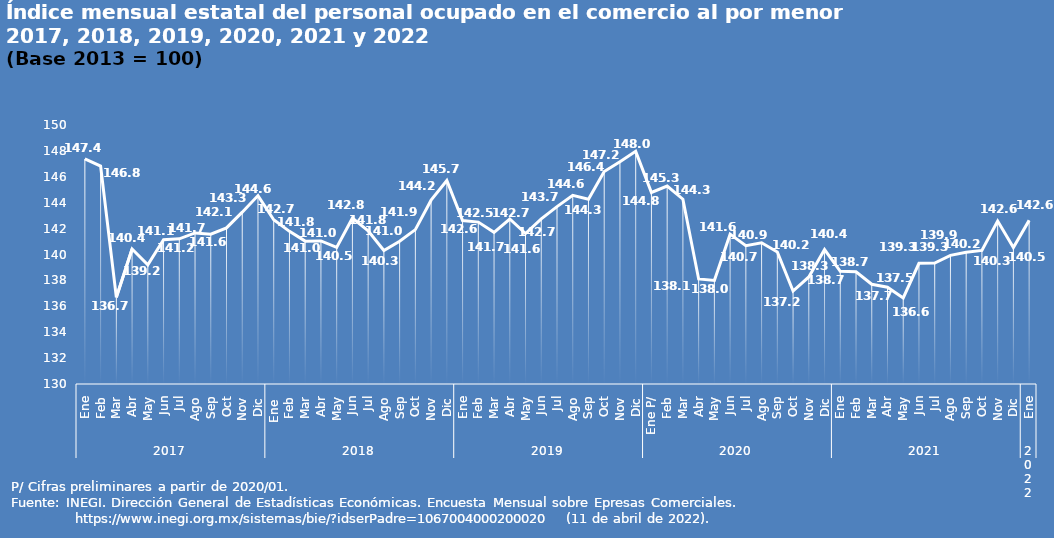
| Category | Series 0 |
|---|---|
| 0 | 147.391 |
| 1 | 146.826 |
| 2 | 136.688 |
| 3 | 140.429 |
| 4 | 139.198 |
| 5 | 141.135 |
| 6 | 141.208 |
| 7 | 141.667 |
| 8 | 141.571 |
| 9 | 142.054 |
| 10 | 143.269 |
| 11 | 144.551 |
| 12 | 142.683 |
| 13 | 141.787 |
| 14 | 141.032 |
| 15 | 141.045 |
| 16 | 140.549 |
| 17 | 142.806 |
| 18 | 141.838 |
| 19 | 140.314 |
| 20 | 141.021 |
| 21 | 141.924 |
| 22 | 144.195 |
| 23 | 145.717 |
| 24 | 142.625 |
| 25 | 142.502 |
| 26 | 141.708 |
| 27 | 142.742 |
| 28 | 141.62 |
| 29 | 142.749 |
| 30 | 143.697 |
| 31 | 144.575 |
| 32 | 144.261 |
| 33 | 146.411 |
| 34 | 147.169 |
| 35 | 147.964 |
| 36 | 144.79 |
| 37 | 145.282 |
| 38 | 144.27 |
| 39 | 138.111 |
| 40 | 138.001 |
| 41 | 141.57 |
| 42 | 140.679 |
| 43 | 140.902 |
| 44 | 140.188 |
| 45 | 137.18 |
| 46 | 138.267 |
| 47 | 140.385 |
| 48 | 138.705 |
| 49 | 138.67 |
| 50 | 137.703 |
| 51 | 137.472 |
| 52 | 136.642 |
| 53 | 139.323 |
| 54 | 139.338 |
| 55 | 139.936 |
| 56 | 140.176 |
| 57 | 140.314 |
| 58 | 142.586 |
| 59 | 140.544 |
| 60 | 142.635 |